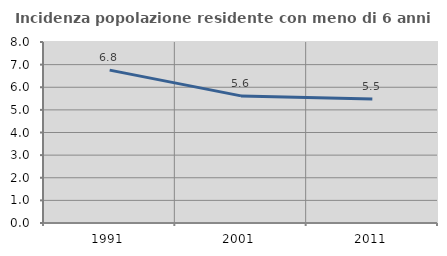
| Category | Incidenza popolazione residente con meno di 6 anni |
|---|---|
| 1991.0 | 6.757 |
| 2001.0 | 5.619 |
| 2011.0 | 5.479 |